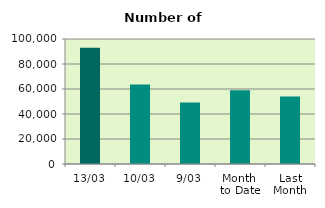
| Category | Series 0 |
|---|---|
| 13/03 | 93056 |
| 10/03 | 63508 |
| 9/03 | 49180 |
| Month 
to Date | 58938 |
| Last
Month | 54034.8 |